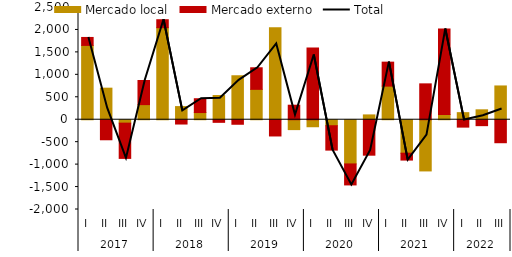
| Category | Mercado local | Mercado externo |
|---|---|---|
| 0 | 1655.56 | 177.301 |
| 1 | 702.963 | -446.607 |
| 2 | -75.967 | -785.675 |
| 3 | 336.364 | 538.061 |
| 4 | 2050.669 | 176.974 |
| 5 | 292.511 | -95.98 |
| 6 | 159.72 | 307.969 |
| 7 | 538.689 | -58.267 |
| 8 | 979.361 | -101.205 |
| 9 | 676.837 | 480.395 |
| 10 | 2049.543 | -361.98 |
| 11 | -220.353 | 323.265 |
| 12 | -156.393 | 1599.437 |
| 13 | -133.868 | -543.113 |
| 14 | -984.868 | -467.691 |
| 15 | 107.247 | -790.064 |
| 16 | 748.563 | 534.137 |
| 17 | -745.582 | -153.332 |
| 18 | -1140.74 | 799.048 |
| 19 | 115.969 | 1903.896 |
| 20 | 157.508 | -164.872 |
| 21 | 220.698 | -132.172 |
| 22 | 752.382 | -512.413 |